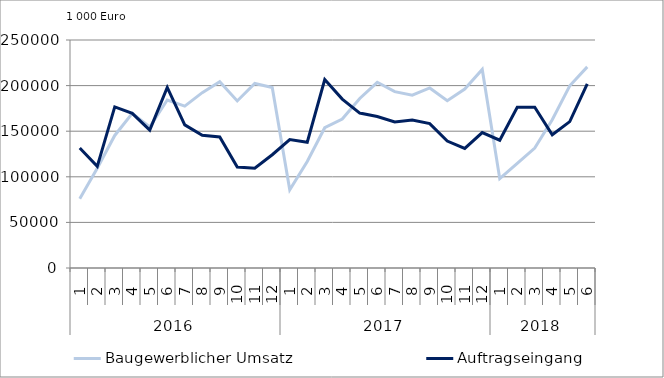
| Category | Baugewerblicher Umsatz | Auftragseingang |
|---|---|---|
| 0 | 76043.538 | 131571.482 |
| 1 | 109483.268 | 111467.248 |
| 2 | 145343.559 | 176673.268 |
| 3 | 169660.551 | 169566.96 |
| 4 | 154554.865 | 151228.165 |
| 5 | 184236.137 | 198035.655 |
| 6 | 177444.278 | 156900.898 |
| 7 | 192230.472 | 145537.167 |
| 8 | 204178.065 | 143616.217 |
| 9 | 183173.849 | 110770.94 |
| 10 | 202302.279 | 109384.188 |
| 11 | 197832.096 | 124193.91 |
| 12 | 85701.947 | 140751.008 |
| 13 | 116743.276 | 137863.383 |
| 14 | 153810.055 | 206710.579 |
| 15 | 163342.989 | 185183.797 |
| 16 | 185946.221 | 169878.51 |
| 17 | 203627.91 | 166148.392 |
| 18 | 193377.256 | 160134.206 |
| 19 | 189429.952 | 162221.206 |
| 20 | 197405.279 | 158305.285 |
| 21 | 183450.026 | 139156.761 |
| 22 | 196209.214 | 131165.419 |
| 23 | 217688.447 | 148434.901 |
| 24 | 97959.056 | 140119.385 |
| 25 | 114756.787 | 176330.213 |
| 26 | 131454.642 | 176241.061 |
| 27 | 162648.053 | 146063.407 |
| 28 | 199809.407 | 160551.931 |
| 29 | 220535.974 | 201835.846 |